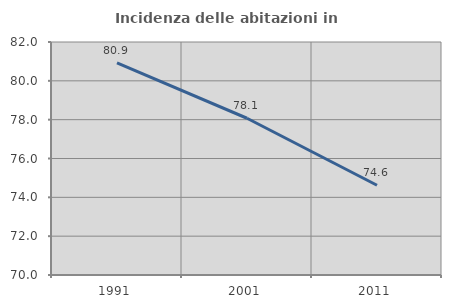
| Category | Incidenza delle abitazioni in proprietà  |
|---|---|
| 1991.0 | 80.921 |
| 2001.0 | 78.073 |
| 2011.0 | 74.622 |